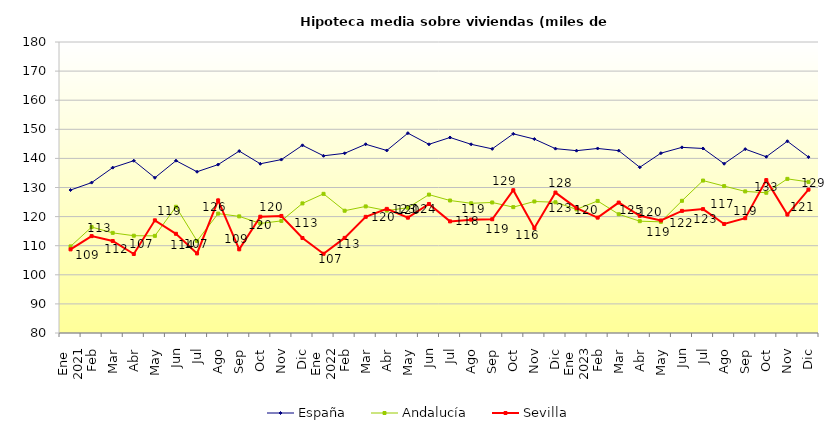
| Category |  España  |  Andalucía  |  Sevilla  |
|---|---|---|---|
| 0 | 129.129 | 109.755 | 108.738 |
| 1 | 131.68 | 116.408 | 113.291 |
| 2 | 136.823 | 114.411 | 111.62 |
| 3 | 139.198 | 113.43 | 107.151 |
| 4 | 133.348 | 113.384 | 118.715 |
| 5 | 139.212 | 123.381 | 114.086 |
| 6 | 135.416 | 111.636 | 107.346 |
| 7 | 137.871 | 121.032 | 125.57 |
| 8 | 142.514 | 120.079 | 108.76 |
| 9 | 138.154 | 117.641 | 119.962 |
| 10 | 139.594 | 118.526 | 120.223 |
| 11 | 144.498 | 124.538 | 112.636 |
| 12 | 140.892 | 127.823 | 107.232 |
| 13 | 141.749 | 122.018 | 112.68 |
| 14 | 144.862 | 123.5 | 119.92 |
| 15 | 142.728 | 122.067 | 122.651 |
| 16 | 148.674 | 123.045 | 119.635 |
| 17 | 144.846 | 127.554 | 124.34 |
| 18 | 147.183 | 125.528 | 118.354 |
| 19 | 144.844 | 124.581 | 118.95 |
| 20 | 143.275 | 124.854 | 119.085 |
| 21 | 148.443 | 123.256 | 129.062 |
| 22 | 146.645 | 125.195 | 116.07 |
| 23 | 143.351 | 124.927 | 128.255 |
| 24 | 142.654 | 122.491 | 122.937 |
| 25 | 143.413 | 125.381 | 119.65 |
| 26 | 142.663 | 120.811 | 124.823 |
| 27 | 136.945 | 118.425 | 120.28 |
| 28 | 141.798 | 118.2 | 118.665 |
| 29 | 143.796 | 125.428 | 121.958 |
| 30 | 143.412 | 132.38 | 122.57 |
| 31 | 138.171 | 130.487 | 117.471 |
| 32 | 143.186 | 128.657 | 119.454 |
| 33 | 140.564 | 128.189 | 132.54 |
| 34 | 145.894 | 132.969 | 120.704 |
| 35 | 140.451 | 131.925 | 129.268 |